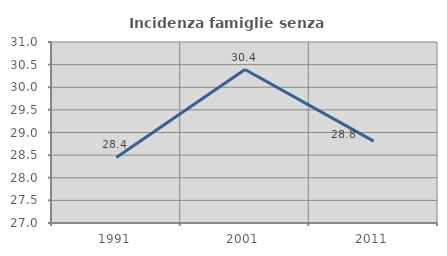
| Category | Incidenza famiglie senza nuclei |
|---|---|
| 1991.0 | 28.448 |
| 2001.0 | 30.391 |
| 2011.0 | 28.809 |